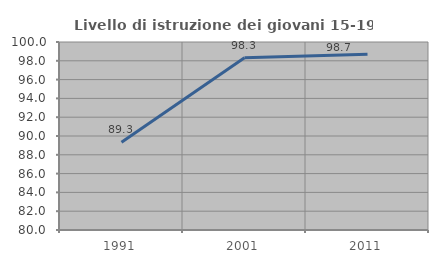
| Category | Livello di istruzione dei giovani 15-19 anni |
|---|---|
| 1991.0 | 89.333 |
| 2001.0 | 98.333 |
| 2011.0 | 98.701 |